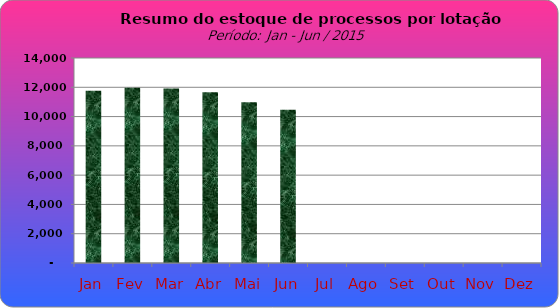
| Category | Series 0 |
|---|---|
| Jan | 11768 |
| Fev | 11973 |
| Mar | 11918 |
| Abr | 11669 |
| Mai | 10977 |
| Jun | 10462 |
| Jul | 0 |
| Ago | 0 |
| Set | 0 |
| Out | 0 |
| Nov | 0 |
| Dez | 0 |